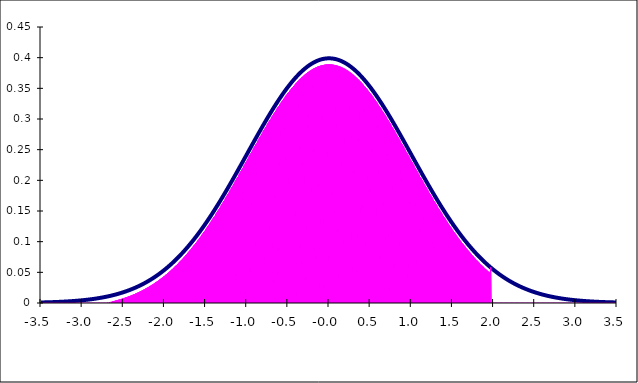
| Category | Series 0 | Series 1 |
|---|---|---|
| -3.5 | 0.001 | 0 |
| -3.495 | 0.001 | 0 |
| -3.49 | 0.001 | 0 |
| -3.4850000000000003 | 0.001 | 0 |
| -3.4800000000000004 | 0.001 | 0 |
| -3.4750000000000005 | 0.001 | 0 |
| -3.4700000000000006 | 0.001 | 0 |
| -3.4650000000000007 | 0.001 | 0 |
| -3.460000000000001 | 0.001 | 0 |
| -3.455000000000001 | 0.001 | 0 |
| -3.450000000000001 | 0.001 | 0 |
| -3.445000000000001 | 0.001 | 0 |
| -3.4400000000000013 | 0.001 | 0 |
| -3.4350000000000014 | 0.001 | 0 |
| -3.4300000000000015 | 0.001 | 0 |
| -3.4250000000000016 | 0.001 | 0 |
| -3.4200000000000017 | 0.001 | 0 |
| -3.415000000000002 | 0.001 | 0 |
| -3.410000000000002 | 0.001 | 0 |
| -3.405000000000002 | 0.001 | 0 |
| -3.400000000000002 | 0.001 | 0 |
| -3.3950000000000022 | 0.001 | 0 |
| -3.3900000000000023 | 0.001 | 0 |
| -3.3850000000000025 | 0.001 | 0 |
| -3.3800000000000026 | 0.001 | 0 |
| -3.3750000000000027 | 0.001 | 0 |
| -3.3700000000000028 | 0.001 | 0 |
| -3.365000000000003 | 0.001 | 0 |
| -3.360000000000003 | 0.001 | 0 |
| -3.355000000000003 | 0.001 | 0 |
| -3.350000000000003 | 0.001 | 0 |
| -3.3450000000000033 | 0.001 | 0 |
| -3.3400000000000034 | 0.002 | 0 |
| -3.3350000000000035 | 0.002 | 0 |
| -3.3300000000000036 | 0.002 | 0 |
| -3.3250000000000037 | 0.002 | 0 |
| -3.320000000000004 | 0.002 | 0 |
| -3.315000000000004 | 0.002 | 0 |
| -3.310000000000004 | 0.002 | 0 |
| -3.305000000000004 | 0.002 | 0 |
| -3.3000000000000043 | 0.002 | 0 |
| -3.2950000000000044 | 0.002 | 0 |
| -3.2900000000000045 | 0.002 | 0 |
| -3.2850000000000046 | 0.002 | 0 |
| -3.2800000000000047 | 0.002 | 0 |
| -3.275000000000005 | 0.002 | 0 |
| -3.270000000000005 | 0.002 | 0 |
| -3.265000000000005 | 0.002 | 0 |
| -3.260000000000005 | 0.002 | 0 |
| -3.2550000000000052 | 0.002 | 0 |
| -3.2500000000000053 | 0.002 | 0 |
| -3.2450000000000054 | 0.002 | 0 |
| -3.2400000000000055 | 0.002 | 0 |
| -3.2350000000000056 | 0.002 | 0 |
| -3.2300000000000058 | 0.002 | 0 |
| -3.225000000000006 | 0.002 | 0 |
| -3.220000000000006 | 0.002 | 0 |
| -3.215000000000006 | 0.002 | 0 |
| -3.210000000000006 | 0.002 | 0 |
| -3.2050000000000063 | 0.002 | 0 |
| -3.2000000000000064 | 0.002 | 0 |
| -3.1950000000000065 | 0.002 | 0 |
| -3.1900000000000066 | 0.002 | 0 |
| -3.1850000000000067 | 0.003 | 0 |
| -3.180000000000007 | 0.003 | 0 |
| -3.175000000000007 | 0.003 | 0 |
| -3.170000000000007 | 0.003 | 0 |
| -3.165000000000007 | 0.003 | 0 |
| -3.1600000000000072 | 0.003 | 0 |
| -3.1550000000000074 | 0.003 | 0 |
| -3.1500000000000075 | 0.003 | 0 |
| -3.1450000000000076 | 0.003 | 0 |
| -3.1400000000000077 | 0.003 | 0 |
| -3.135000000000008 | 0.003 | 0 |
| -3.130000000000008 | 0.003 | 0 |
| -3.125000000000008 | 0.003 | 0 |
| -3.120000000000008 | 0.003 | 0 |
| -3.115000000000008 | 0.003 | 0 |
| -3.1100000000000083 | 0.003 | 0 |
| -3.1050000000000084 | 0.003 | 0 |
| -3.1000000000000085 | 0.003 | 0 |
| -3.0950000000000086 | 0.003 | 0 |
| -3.0900000000000087 | 0.003 | 0 |
| -3.085000000000009 | 0.003 | 0 |
| -3.080000000000009 | 0.003 | 0 |
| -3.075000000000009 | 0.004 | 0 |
| -3.070000000000009 | 0.004 | 0 |
| -3.0650000000000093 | 0.004 | 0 |
| -3.0600000000000094 | 0.004 | 0 |
| -3.0550000000000095 | 0.004 | 0 |
| -3.0500000000000096 | 0.004 | 0 |
| -3.0450000000000097 | 0.004 | 0 |
| -3.04000000000001 | 0.004 | 0 |
| -3.03500000000001 | 0.004 | 0 |
| -3.03000000000001 | 0.004 | 0 |
| -3.02500000000001 | 0.004 | 0 |
| -3.0200000000000102 | 0.004 | 0 |
| -3.0150000000000103 | 0.004 | 0 |
| -3.0100000000000104 | 0.004 | 0 |
| -3.0050000000000106 | 0.004 | 0 |
| -3.0000000000000107 | 0.004 | 0 |
| -2.9950000000000108 | 0.004 | 0 |
| -2.990000000000011 | 0.005 | 0 |
| -2.985000000000011 | 0.005 | 0 |
| -2.980000000000011 | 0.005 | 0 |
| -2.975000000000011 | 0.005 | 0 |
| -2.9700000000000113 | 0.005 | 0 |
| -2.9650000000000114 | 0.005 | 0 |
| -2.9600000000000115 | 0.005 | 0 |
| -2.9550000000000116 | 0.005 | 0 |
| -2.9500000000000117 | 0.005 | 0 |
| -2.945000000000012 | 0.005 | 0 |
| -2.940000000000012 | 0.005 | 0 |
| -2.935000000000012 | 0.005 | 0 |
| -2.930000000000012 | 0.005 | 0 |
| -2.9250000000000123 | 0.006 | 0 |
| -2.9200000000000124 | 0.006 | 0 |
| -2.9150000000000125 | 0.006 | 0 |
| -2.9100000000000126 | 0.006 | 0 |
| -2.9050000000000127 | 0.006 | 0 |
| -2.900000000000013 | 0.006 | 0 |
| -2.895000000000013 | 0.006 | 0 |
| -2.890000000000013 | 0.006 | 0 |
| -2.885000000000013 | 0.006 | 0 |
| -2.880000000000013 | 0.006 | 0 |
| -2.8750000000000133 | 0.006 | 0 |
| -2.8700000000000134 | 0.006 | 0 |
| -2.8650000000000135 | 0.007 | 0 |
| -2.8600000000000136 | 0.007 | 0 |
| -2.8550000000000137 | 0.007 | 0 |
| -2.850000000000014 | 0.007 | 0 |
| -2.845000000000014 | 0.007 | 0 |
| -2.840000000000014 | 0.007 | 0 |
| -2.835000000000014 | 0.007 | 0 |
| -2.8300000000000143 | 0.007 | 0 |
| -2.8250000000000144 | 0.007 | 0 |
| -2.8200000000000145 | 0.007 | 0 |
| -2.8150000000000146 | 0.008 | 0 |
| -2.8100000000000147 | 0.008 | 0 |
| -2.805000000000015 | 0.008 | 0 |
| -2.800000000000015 | 0.008 | 0 |
| -2.795000000000015 | 0.008 | 0 |
| -2.790000000000015 | 0.008 | 0 |
| -2.7850000000000152 | 0.008 | 0 |
| -2.7800000000000153 | 0.008 | 0 |
| -2.7750000000000155 | 0.008 | 0 |
| -2.7700000000000156 | 0.009 | 0 |
| -2.7650000000000157 | 0.009 | 0 |
| -2.7600000000000158 | 0.009 | 0 |
| -2.755000000000016 | 0.009 | 0 |
| -2.750000000000016 | 0.009 | 0 |
| -2.745000000000016 | 0.009 | 0 |
| -2.740000000000016 | 0.009 | 0 |
| -2.7350000000000163 | 0.009 | 0 |
| -2.7300000000000164 | 0.01 | 0 |
| -2.7250000000000165 | 0.01 | 0 |
| -2.7200000000000166 | 0.01 | 0 |
| -2.7150000000000167 | 0.01 | 0 |
| -2.710000000000017 | 0.01 | 0 |
| -2.705000000000017 | 0.01 | 0 |
| -2.700000000000017 | 0.01 | 0 |
| -2.695000000000017 | 0.011 | 0 |
| -2.6900000000000173 | 0.011 | 0.001 |
| -2.6850000000000174 | 0.011 | 0 |
| -2.6800000000000175 | 0.011 | 0.001 |
| -2.6750000000000176 | 0.011 | 0 |
| -2.6700000000000177 | 0.011 | 0.001 |
| -2.665000000000018 | 0.011 | 0 |
| -2.660000000000018 | 0.012 | 0.002 |
| -2.655000000000018 | 0.012 | 0 |
| -2.650000000000018 | 0.012 | 0.002 |
| -2.6450000000000182 | 0.012 | 0 |
| -2.6400000000000183 | 0.012 | 0.002 |
| -2.6350000000000184 | 0.012 | 0 |
| -2.6300000000000185 | 0.013 | 0.003 |
| -2.6250000000000187 | 0.013 | 0 |
| -2.6200000000000188 | 0.013 | 0.003 |
| -2.615000000000019 | 0.013 | 0 |
| -2.610000000000019 | 0.013 | 0.003 |
| -2.605000000000019 | 0.013 | 0 |
| -2.600000000000019 | 0.014 | 0.004 |
| -2.5950000000000193 | 0.014 | 0 |
| -2.5900000000000194 | 0.014 | 0.004 |
| -2.5850000000000195 | 0.014 | 0 |
| -2.5800000000000196 | 0.014 | 0.004 |
| -2.5750000000000197 | 0.014 | 0 |
| -2.57000000000002 | 0.015 | 0.005 |
| -2.56500000000002 | 0.015 | 0 |
| -2.56000000000002 | 0.015 | 0.005 |
| -2.55500000000002 | 0.015 | 0 |
| -2.5500000000000203 | 0.015 | 0.005 |
| -2.5450000000000204 | 0.016 | 0 |
| -2.5400000000000205 | 0.016 | 0.006 |
| -2.5350000000000206 | 0.016 | 0 |
| -2.5300000000000207 | 0.016 | 0.006 |
| -2.525000000000021 | 0.016 | 0 |
| -2.520000000000021 | 0.017 | 0.007 |
| -2.515000000000021 | 0.017 | 0 |
| -2.510000000000021 | 0.017 | 0.007 |
| -2.505000000000021 | 0.017 | 0 |
| -2.5000000000000213 | 0.018 | 0.008 |
| -2.4950000000000214 | 0.018 | 0 |
| -2.4900000000000215 | 0.018 | 0.008 |
| -2.4850000000000216 | 0.018 | 0 |
| -2.4800000000000217 | 0.018 | 0.008 |
| -2.475000000000022 | 0.019 | 0 |
| -2.470000000000022 | 0.019 | 0.009 |
| -2.465000000000022 | 0.019 | 0 |
| -2.460000000000022 | 0.019 | 0.009 |
| -2.4550000000000223 | 0.02 | 0 |
| -2.4500000000000224 | 0.02 | 0.01 |
| -2.4450000000000225 | 0.02 | 0 |
| -2.4400000000000226 | 0.02 | 0.01 |
| -2.4350000000000227 | 0.021 | 0 |
| -2.430000000000023 | 0.021 | 0.011 |
| -2.425000000000023 | 0.021 | 0 |
| -2.420000000000023 | 0.021 | 0.011 |
| -2.415000000000023 | 0.022 | 0 |
| -2.4100000000000232 | 0.022 | 0.012 |
| -2.4050000000000233 | 0.022 | 0 |
| -2.4000000000000234 | 0.022 | 0.012 |
| -2.3950000000000236 | 0.023 | 0 |
| -2.3900000000000237 | 0.023 | 0.013 |
| -2.3850000000000238 | 0.023 | 0 |
| -2.380000000000024 | 0.023 | 0.013 |
| -2.375000000000024 | 0.024 | 0 |
| -2.370000000000024 | 0.024 | 0.014 |
| -2.365000000000024 | 0.024 | 0 |
| -2.3600000000000243 | 0.025 | 0.015 |
| -2.3550000000000244 | 0.025 | 0 |
| -2.3500000000000245 | 0.025 | 0.015 |
| -2.3450000000000246 | 0.026 | 0 |
| -2.3400000000000247 | 0.026 | 0.016 |
| -2.335000000000025 | 0.026 | 0 |
| -2.330000000000025 | 0.026 | 0.016 |
| -2.325000000000025 | 0.027 | 0 |
| -2.320000000000025 | 0.027 | 0.017 |
| -2.3150000000000253 | 0.027 | 0 |
| -2.3100000000000254 | 0.028 | 0.018 |
| -2.3050000000000255 | 0.028 | 0 |
| -2.3000000000000256 | 0.028 | 0.018 |
| -2.2950000000000257 | 0.029 | 0 |
| -2.290000000000026 | 0.029 | 0.019 |
| -2.285000000000026 | 0.029 | 0 |
| -2.280000000000026 | 0.03 | 0.02 |
| -2.275000000000026 | 0.03 | 0 |
| -2.270000000000026 | 0.03 | 0.02 |
| -2.2650000000000263 | 0.031 | 0 |
| -2.2600000000000264 | 0.031 | 0.021 |
| -2.2550000000000265 | 0.031 | 0 |
| -2.2500000000000266 | 0.032 | 0.022 |
| -2.2450000000000268 | 0.032 | 0 |
| -2.240000000000027 | 0.032 | 0.022 |
| -2.235000000000027 | 0.033 | 0 |
| -2.230000000000027 | 0.033 | 0.023 |
| -2.225000000000027 | 0.034 | 0 |
| -2.2200000000000273 | 0.034 | 0.024 |
| -2.2150000000000274 | 0.034 | 0 |
| -2.2100000000000275 | 0.035 | 0.025 |
| -2.2050000000000276 | 0.035 | 0 |
| -2.2000000000000277 | 0.035 | 0.025 |
| -2.195000000000028 | 0.036 | 0 |
| -2.190000000000028 | 0.036 | 0.026 |
| -2.185000000000028 | 0.037 | 0 |
| -2.180000000000028 | 0.037 | 0.027 |
| -2.1750000000000282 | 0.037 | 0 |
| -2.1700000000000284 | 0.038 | 0.028 |
| -2.1650000000000285 | 0.038 | 0 |
| -2.1600000000000286 | 0.039 | 0.029 |
| -2.1550000000000287 | 0.039 | 0 |
| -2.1500000000000288 | 0.04 | 0.03 |
| -2.145000000000029 | 0.04 | 0 |
| -2.140000000000029 | 0.04 | 0.03 |
| -2.135000000000029 | 0.041 | 0 |
| -2.130000000000029 | 0.041 | 0.031 |
| -2.1250000000000293 | 0.042 | 0 |
| -2.1200000000000294 | 0.042 | 0.032 |
| -2.1150000000000295 | 0.043 | 0 |
| -2.1100000000000296 | 0.043 | 0.033 |
| -2.1050000000000297 | 0.044 | 0 |
| -2.10000000000003 | 0.044 | 0.034 |
| -2.09500000000003 | 0.044 | 0 |
| -2.09000000000003 | 0.045 | 0.035 |
| -2.08500000000003 | 0.045 | 0 |
| -2.0800000000000303 | 0.046 | 0.036 |
| -2.0750000000000304 | 0.046 | 0 |
| -2.0700000000000305 | 0.047 | 0.037 |
| -2.0650000000000306 | 0.047 | 0 |
| -2.0600000000000307 | 0.048 | 0.038 |
| -2.055000000000031 | 0.048 | 0 |
| -2.050000000000031 | 0.049 | 0.039 |
| -2.045000000000031 | 0.049 | 0 |
| -2.040000000000031 | 0.05 | 0.04 |
| -2.0350000000000312 | 0.05 | 0 |
| -2.0300000000000313 | 0.051 | 0.041 |
| -2.0250000000000314 | 0.051 | 0 |
| -2.0200000000000315 | 0.052 | 0.042 |
| -2.0150000000000317 | 0.052 | 0 |
| -2.0100000000000318 | 0.053 | 0.043 |
| -2.005000000000032 | 0.053 | 0 |
| -2.000000000000032 | 0.054 | 0.044 |
| -1.995000000000032 | 0.055 | 0 |
| -1.990000000000032 | 0.055 | 0.045 |
| -1.985000000000032 | 0.056 | 0 |
| -1.980000000000032 | 0.056 | 0.046 |
| -1.975000000000032 | 0.057 | 0 |
| -1.970000000000032 | 0.057 | 0.047 |
| -1.965000000000032 | 0.058 | 0 |
| -1.960000000000032 | 0.058 | 0.048 |
| -1.955000000000032 | 0.059 | 0 |
| -1.950000000000032 | 0.06 | 0.05 |
| -1.945000000000032 | 0.06 | 0 |
| -1.940000000000032 | 0.061 | 0.051 |
| -1.935000000000032 | 0.061 | 0 |
| -1.930000000000032 | 0.062 | 0.052 |
| -1.925000000000032 | 0.063 | 0 |
| -1.920000000000032 | 0.063 | 0.053 |
| -1.915000000000032 | 0.064 | 0 |
| -1.910000000000032 | 0.064 | 0.054 |
| -1.905000000000032 | 0.065 | 0 |
| -1.9000000000000319 | 0.066 | 0.056 |
| -1.895000000000032 | 0.066 | 0 |
| -1.8900000000000319 | 0.067 | 0.057 |
| -1.885000000000032 | 0.068 | 0 |
| -1.8800000000000319 | 0.068 | 0.058 |
| -1.875000000000032 | 0.069 | 0 |
| -1.8700000000000319 | 0.069 | 0.059 |
| -1.865000000000032 | 0.07 | 0 |
| -1.8600000000000319 | 0.071 | 0.061 |
| -1.855000000000032 | 0.071 | 0 |
| -1.8500000000000318 | 0.072 | 0.062 |
| -1.845000000000032 | 0.073 | 0 |
| -1.8400000000000318 | 0.073 | 0.063 |
| -1.835000000000032 | 0.074 | 0 |
| -1.8300000000000318 | 0.075 | 0.065 |
| -1.825000000000032 | 0.075 | 0 |
| -1.8200000000000318 | 0.076 | 0.066 |
| -1.815000000000032 | 0.077 | 0 |
| -1.8100000000000318 | 0.078 | 0.068 |
| -1.805000000000032 | 0.078 | 0 |
| -1.8000000000000318 | 0.079 | 0.069 |
| -1.795000000000032 | 0.08 | 0 |
| -1.7900000000000318 | 0.08 | 0.07 |
| -1.785000000000032 | 0.081 | 0 |
| -1.7800000000000318 | 0.082 | 0.072 |
| -1.7750000000000319 | 0.083 | 0 |
| -1.7700000000000318 | 0.083 | 0.073 |
| -1.7650000000000319 | 0.084 | 0 |
| -1.7600000000000318 | 0.085 | 0.075 |
| -1.7550000000000319 | 0.086 | 0 |
| -1.7500000000000318 | 0.086 | 0.076 |
| -1.7450000000000319 | 0.087 | 0 |
| -1.7400000000000317 | 0.088 | 0.078 |
| -1.7350000000000319 | 0.089 | 0 |
| -1.7300000000000317 | 0.089 | 0.079 |
| -1.7250000000000318 | 0.09 | 0 |
| -1.7200000000000317 | 0.091 | 0.081 |
| -1.7150000000000318 | 0.092 | 0 |
| -1.7100000000000317 | 0.092 | 0.082 |
| -1.7050000000000318 | 0.093 | 0 |
| -1.7000000000000317 | 0.094 | 0.084 |
| -1.6950000000000318 | 0.095 | 0 |
| -1.6900000000000317 | 0.096 | 0.086 |
| -1.6850000000000318 | 0.096 | 0 |
| -1.6800000000000317 | 0.097 | 0.087 |
| -1.6750000000000318 | 0.098 | 0 |
| -1.6700000000000317 | 0.099 | 0.089 |
| -1.6650000000000318 | 0.1 | 0 |
| -1.6600000000000317 | 0.101 | 0.091 |
| -1.6550000000000318 | 0.101 | 0 |
| -1.6500000000000317 | 0.102 | 0.092 |
| -1.6450000000000318 | 0.103 | 0 |
| -1.6400000000000317 | 0.104 | 0.094 |
| -1.6350000000000318 | 0.105 | 0 |
| -1.6300000000000316 | 0.106 | 0.096 |
| -1.6250000000000318 | 0.107 | 0 |
| -1.6200000000000316 | 0.107 | 0.097 |
| -1.6150000000000317 | 0.108 | 0 |
| -1.6100000000000316 | 0.109 | 0.099 |
| -1.6050000000000317 | 0.11 | 0 |
| -1.6000000000000316 | 0.111 | 0.101 |
| -1.5950000000000317 | 0.112 | 0 |
| -1.5900000000000316 | 0.113 | 0.103 |
| -1.5850000000000317 | 0.114 | 0 |
| -1.5800000000000316 | 0.115 | 0.105 |
| -1.5750000000000317 | 0.115 | 0 |
| -1.5700000000000316 | 0.116 | 0.106 |
| -1.5650000000000317 | 0.117 | 0 |
| -1.5600000000000316 | 0.118 | 0.108 |
| -1.5550000000000317 | 0.119 | 0 |
| -1.5500000000000316 | 0.12 | 0.11 |
| -1.5450000000000317 | 0.121 | 0 |
| -1.5400000000000316 | 0.122 | 0.112 |
| -1.5350000000000317 | 0.123 | 0 |
| -1.5300000000000316 | 0.124 | 0.114 |
| -1.5250000000000317 | 0.125 | 0 |
| -1.5200000000000315 | 0.126 | 0.116 |
| -1.5150000000000317 | 0.127 | 0 |
| -1.5100000000000315 | 0.128 | 0.118 |
| -1.5050000000000316 | 0.129 | 0 |
| -1.5000000000000315 | 0.13 | 0.12 |
| -1.4950000000000316 | 0.13 | 0 |
| -1.4900000000000315 | 0.131 | 0.121 |
| -1.4850000000000316 | 0.132 | 0 |
| -1.4800000000000315 | 0.133 | 0.123 |
| -1.4750000000000316 | 0.134 | 0 |
| -1.4700000000000315 | 0.135 | 0.125 |
| -1.4650000000000316 | 0.136 | 0 |
| -1.4600000000000315 | 0.137 | 0.127 |
| -1.4550000000000316 | 0.138 | 0 |
| -1.4500000000000315 | 0.139 | 0.129 |
| -1.4450000000000316 | 0.14 | 0 |
| -1.4400000000000315 | 0.141 | 0.131 |
| -1.4350000000000316 | 0.142 | 0 |
| -1.4300000000000315 | 0.144 | 0.134 |
| -1.4250000000000316 | 0.145 | 0 |
| -1.4200000000000315 | 0.146 | 0.136 |
| -1.4150000000000316 | 0.147 | 0 |
| -1.4100000000000315 | 0.148 | 0.138 |
| -1.4050000000000316 | 0.149 | 0 |
| -1.4000000000000314 | 0.15 | 0.14 |
| -1.3950000000000315 | 0.151 | 0 |
| -1.3900000000000314 | 0.152 | 0.142 |
| -1.3850000000000315 | 0.153 | 0 |
| -1.3800000000000314 | 0.154 | 0.144 |
| -1.3750000000000315 | 0.155 | 0 |
| -1.3700000000000314 | 0.156 | 0.146 |
| -1.3650000000000315 | 0.157 | 0 |
| -1.3600000000000314 | 0.158 | 0.148 |
| -1.3550000000000315 | 0.159 | 0 |
| -1.3500000000000314 | 0.16 | 0.15 |
| -1.3450000000000315 | 0.161 | 0 |
| -1.3400000000000314 | 0.163 | 0.153 |
| -1.3350000000000315 | 0.164 | 0 |
| -1.3300000000000314 | 0.165 | 0.155 |
| -1.3250000000000315 | 0.166 | 0 |
| -1.3200000000000314 | 0.167 | 0.157 |
| -1.3150000000000315 | 0.168 | 0 |
| -1.3100000000000314 | 0.169 | 0.159 |
| -1.3050000000000315 | 0.17 | 0 |
| -1.3000000000000314 | 0.171 | 0.161 |
| -1.2950000000000315 | 0.172 | 0 |
| -1.2900000000000313 | 0.174 | 0.164 |
| -1.2850000000000315 | 0.175 | 0 |
| -1.2800000000000313 | 0.176 | 0.166 |
| -1.2750000000000314 | 0.177 | 0 |
| -1.2700000000000313 | 0.178 | 0.168 |
| -1.2650000000000314 | 0.179 | 0 |
| -1.2600000000000313 | 0.18 | 0.17 |
| -1.2550000000000314 | 0.182 | 0 |
| -1.2500000000000313 | 0.183 | 0.173 |
| -1.2450000000000314 | 0.184 | 0 |
| -1.2400000000000313 | 0.185 | 0.175 |
| -1.2350000000000314 | 0.186 | 0 |
| -1.2300000000000313 | 0.187 | 0.177 |
| -1.2250000000000314 | 0.188 | 0 |
| -1.2200000000000313 | 0.19 | 0.18 |
| -1.2150000000000314 | 0.191 | 0 |
| -1.2100000000000313 | 0.192 | 0.182 |
| -1.2050000000000314 | 0.193 | 0 |
| -1.2000000000000313 | 0.194 | 0.184 |
| -1.1950000000000314 | 0.195 | 0 |
| -1.1900000000000313 | 0.197 | 0.187 |
| -1.1850000000000314 | 0.198 | 0 |
| -1.1800000000000312 | 0.199 | 0.189 |
| -1.1750000000000314 | 0.2 | 0 |
| -1.1700000000000312 | 0.201 | 0.191 |
| -1.1650000000000313 | 0.202 | 0 |
| -1.1600000000000312 | 0.204 | 0.194 |
| -1.1550000000000313 | 0.205 | 0 |
| -1.1500000000000312 | 0.206 | 0.196 |
| -1.1450000000000313 | 0.207 | 0 |
| -1.1400000000000312 | 0.208 | 0.198 |
| -1.1350000000000313 | 0.209 | 0 |
| -1.1300000000000312 | 0.211 | 0.201 |
| -1.1250000000000313 | 0.212 | 0 |
| -1.1200000000000312 | 0.213 | 0.203 |
| -1.1150000000000313 | 0.214 | 0 |
| -1.1100000000000312 | 0.215 | 0.205 |
| -1.1050000000000313 | 0.217 | 0 |
| -1.1000000000000312 | 0.218 | 0.208 |
| -1.0950000000000313 | 0.219 | 0 |
| -1.0900000000000312 | 0.22 | 0.21 |
| -1.0850000000000313 | 0.221 | 0 |
| -1.0800000000000312 | 0.223 | 0.213 |
| -1.0750000000000313 | 0.224 | 0 |
| -1.0700000000000311 | 0.225 | 0.215 |
| -1.0650000000000313 | 0.226 | 0 |
| -1.0600000000000311 | 0.227 | 0.217 |
| -1.0550000000000312 | 0.229 | 0 |
| -1.0500000000000311 | 0.23 | 0.22 |
| -1.0450000000000312 | 0.231 | 0 |
| -1.0400000000000311 | 0.232 | 0.222 |
| -1.0350000000000312 | 0.234 | 0 |
| -1.0300000000000311 | 0.235 | 0.225 |
| -1.0250000000000312 | 0.236 | 0 |
| -1.020000000000031 | 0.237 | 0.227 |
| -1.0150000000000312 | 0.238 | 0 |
| -1.010000000000031 | 0.24 | 0.23 |
| -1.0050000000000312 | 0.241 | 0 |
| -1.000000000000031 | 0.242 | 0.232 |
| -0.9950000000000311 | 0.243 | 0 |
| -0.9900000000000311 | 0.244 | 0.234 |
| -0.9850000000000311 | 0.246 | 0 |
| -0.9800000000000311 | 0.247 | 0.237 |
| -0.9750000000000311 | 0.248 | 0 |
| -0.9700000000000311 | 0.249 | 0.239 |
| -0.965000000000031 | 0.25 | 0 |
| -0.960000000000031 | 0.252 | 0.242 |
| -0.955000000000031 | 0.253 | 0 |
| -0.950000000000031 | 0.254 | 0.244 |
| -0.945000000000031 | 0.255 | 0 |
| -0.940000000000031 | 0.256 | 0.246 |
| -0.935000000000031 | 0.258 | 0 |
| -0.930000000000031 | 0.259 | 0.249 |
| -0.925000000000031 | 0.26 | 0 |
| -0.920000000000031 | 0.261 | 0.251 |
| -0.915000000000031 | 0.262 | 0 |
| -0.910000000000031 | 0.264 | 0.254 |
| -0.905000000000031 | 0.265 | 0 |
| -0.900000000000031 | 0.266 | 0.256 |
| -0.895000000000031 | 0.267 | 0 |
| -0.890000000000031 | 0.268 | 0.258 |
| -0.885000000000031 | 0.27 | 0 |
| -0.880000000000031 | 0.271 | 0.261 |
| -0.875000000000031 | 0.272 | 0 |
| -0.870000000000031 | 0.273 | 0.263 |
| -0.865000000000031 | 0.274 | 0 |
| -0.860000000000031 | 0.276 | 0.266 |
| -0.855000000000031 | 0.277 | 0 |
| -0.850000000000031 | 0.278 | 0.268 |
| -0.845000000000031 | 0.279 | 0 |
| -0.8400000000000309 | 0.28 | 0.27 |
| -0.8350000000000309 | 0.282 | 0 |
| -0.8300000000000309 | 0.283 | 0.273 |
| -0.8250000000000309 | 0.284 | 0 |
| -0.8200000000000309 | 0.285 | 0.275 |
| -0.8150000000000309 | 0.286 | 0 |
| -0.8100000000000309 | 0.287 | 0.277 |
| -0.8050000000000309 | 0.289 | 0 |
| -0.8000000000000309 | 0.29 | 0.28 |
| -0.7950000000000309 | 0.291 | 0 |
| -0.7900000000000309 | 0.292 | 0.282 |
| -0.7850000000000309 | 0.293 | 0 |
| -0.7800000000000309 | 0.294 | 0.284 |
| -0.7750000000000309 | 0.295 | 0 |
| -0.7700000000000309 | 0.297 | 0.287 |
| -0.7650000000000309 | 0.298 | 0 |
| -0.7600000000000309 | 0.299 | 0.289 |
| -0.7550000000000309 | 0.3 | 0 |
| -0.7500000000000309 | 0.301 | 0.291 |
| -0.7450000000000309 | 0.302 | 0 |
| -0.7400000000000309 | 0.303 | 0.293 |
| -0.7350000000000309 | 0.305 | 0 |
| -0.7300000000000308 | 0.306 | 0.296 |
| -0.7250000000000308 | 0.307 | 0 |
| -0.7200000000000308 | 0.308 | 0.298 |
| -0.7150000000000308 | 0.309 | 0 |
| -0.7100000000000308 | 0.31 | 0.3 |
| -0.7050000000000308 | 0.311 | 0 |
| -0.7000000000000308 | 0.312 | 0.302 |
| -0.6950000000000308 | 0.313 | 0 |
| -0.6900000000000308 | 0.314 | 0.304 |
| -0.6850000000000308 | 0.316 | 0 |
| -0.6800000000000308 | 0.317 | 0.307 |
| -0.6750000000000308 | 0.318 | 0 |
| -0.6700000000000308 | 0.319 | 0.309 |
| -0.6650000000000308 | 0.32 | 0 |
| -0.6600000000000308 | 0.321 | 0.311 |
| -0.6550000000000308 | 0.322 | 0 |
| -0.6500000000000308 | 0.323 | 0.313 |
| -0.6450000000000308 | 0.324 | 0 |
| -0.6400000000000308 | 0.325 | 0.315 |
| -0.6350000000000308 | 0.326 | 0 |
| -0.6300000000000308 | 0.327 | 0.317 |
| -0.6250000000000308 | 0.328 | 0 |
| -0.6200000000000307 | 0.329 | 0.319 |
| -0.6150000000000307 | 0.33 | 0 |
| -0.6100000000000307 | 0.331 | 0.321 |
| -0.6050000000000307 | 0.332 | 0 |
| -0.6000000000000307 | 0.333 | 0.323 |
| -0.5950000000000307 | 0.334 | 0 |
| -0.5900000000000307 | 0.335 | 0.325 |
| -0.5850000000000307 | 0.336 | 0 |
| -0.5800000000000307 | 0.337 | 0.327 |
| -0.5750000000000307 | 0.338 | 0 |
| -0.5700000000000307 | 0.339 | 0.329 |
| -0.5650000000000307 | 0.34 | 0 |
| -0.5600000000000307 | 0.341 | 0.331 |
| -0.5550000000000307 | 0.342 | 0 |
| -0.5500000000000307 | 0.343 | 0.333 |
| -0.5450000000000307 | 0.344 | 0 |
| -0.5400000000000307 | 0.345 | 0.335 |
| -0.5350000000000307 | 0.346 | 0 |
| -0.5300000000000307 | 0.347 | 0.337 |
| -0.5250000000000307 | 0.348 | 0 |
| -0.5200000000000307 | 0.348 | 0.338 |
| -0.5150000000000307 | 0.349 | 0 |
| -0.5100000000000307 | 0.35 | 0.34 |
| -0.5050000000000306 | 0.351 | 0 |
| -0.5000000000000306 | 0.352 | 0.342 |
| -0.49500000000003064 | 0.353 | 0 |
| -0.49000000000003063 | 0.354 | 0.344 |
| -0.48500000000003063 | 0.355 | 0 |
| -0.4800000000000306 | 0.356 | 0.346 |
| -0.4750000000000306 | 0.356 | 0 |
| -0.4700000000000306 | 0.357 | 0.347 |
| -0.4650000000000306 | 0.358 | 0 |
| -0.4600000000000306 | 0.359 | 0.349 |
| -0.4550000000000306 | 0.36 | 0 |
| -0.4500000000000306 | 0.361 | 0.351 |
| -0.4450000000000306 | 0.361 | 0 |
| -0.4400000000000306 | 0.362 | 0.352 |
| -0.4350000000000306 | 0.363 | 0 |
| -0.4300000000000306 | 0.364 | 0.354 |
| -0.4250000000000306 | 0.364 | 0 |
| -0.42000000000003057 | 0.365 | 0.355 |
| -0.41500000000003057 | 0.366 | 0 |
| -0.41000000000003056 | 0.367 | 0.357 |
| -0.40500000000003056 | 0.368 | 0 |
| -0.40000000000003055 | 0.368 | 0.358 |
| -0.39500000000003055 | 0.369 | 0 |
| -0.39000000000003054 | 0.37 | 0.36 |
| -0.38500000000003054 | 0.37 | 0 |
| -0.38000000000003054 | 0.371 | 0.361 |
| -0.37500000000003053 | 0.372 | 0 |
| -0.3700000000000305 | 0.373 | 0.363 |
| -0.3650000000000305 | 0.373 | 0 |
| -0.3600000000000305 | 0.374 | 0.364 |
| -0.3550000000000305 | 0.375 | 0 |
| -0.3500000000000305 | 0.375 | 0.365 |
| -0.3450000000000305 | 0.376 | 0 |
| -0.3400000000000305 | 0.377 | 0.367 |
| -0.3350000000000305 | 0.377 | 0 |
| -0.3300000000000305 | 0.378 | 0.368 |
| -0.3250000000000305 | 0.378 | 0 |
| -0.3200000000000305 | 0.379 | 0.369 |
| -0.3150000000000305 | 0.38 | 0 |
| -0.3100000000000305 | 0.38 | 0.37 |
| -0.30500000000003047 | 0.381 | 0 |
| -0.30000000000003046 | 0.381 | 0.371 |
| -0.29500000000003046 | 0.382 | 0 |
| -0.29000000000003046 | 0.383 | 0.373 |
| -0.28500000000003045 | 0.383 | 0 |
| -0.28000000000003045 | 0.384 | 0.374 |
| -0.27500000000003044 | 0.384 | 0 |
| -0.27000000000003044 | 0.385 | 0.375 |
| -0.26500000000003043 | 0.385 | 0 |
| -0.26000000000003043 | 0.386 | 0.376 |
| -0.2550000000000304 | 0.386 | 0 |
| -0.2500000000000304 | 0.387 | 0.377 |
| -0.24500000000003042 | 0.387 | 0 |
| -0.2400000000000304 | 0.388 | 0.378 |
| -0.2350000000000304 | 0.388 | 0 |
| -0.2300000000000304 | 0.389 | 0.379 |
| -0.2250000000000304 | 0.389 | 0 |
| -0.2200000000000304 | 0.389 | 0.379 |
| -0.2150000000000304 | 0.39 | 0 |
| -0.21000000000003038 | 0.39 | 0.38 |
| -0.20500000000003038 | 0.391 | 0 |
| -0.20000000000003038 | 0.391 | 0.381 |
| -0.19500000000003037 | 0.391 | 0 |
| -0.19000000000003037 | 0.392 | 0.382 |
| -0.18500000000003036 | 0.392 | 0 |
| -0.18000000000003036 | 0.393 | 0.383 |
| -0.17500000000003035 | 0.393 | 0 |
| -0.17000000000003035 | 0.393 | 0.383 |
| -0.16500000000003034 | 0.394 | 0 |
| -0.16000000000003034 | 0.394 | 0.384 |
| -0.15500000000003034 | 0.394 | 0 |
| -0.15000000000003033 | 0.394 | 0.384 |
| -0.14500000000003033 | 0.395 | 0 |
| -0.14000000000003032 | 0.395 | 0.385 |
| -0.13500000000003032 | 0.395 | 0 |
| -0.1300000000000303 | 0.396 | 0.386 |
| -0.1250000000000303 | 0.396 | 0 |
| -0.12000000000003032 | 0.396 | 0.386 |
| -0.11500000000003031 | 0.396 | 0 |
| -0.11000000000003032 | 0.397 | 0.387 |
| -0.10500000000003032 | 0.397 | 0 |
| -0.10000000000003033 | 0.397 | 0.387 |
| -0.09500000000003032 | 0.397 | 0 |
| -0.09000000000003033 | 0.397 | 0.387 |
| -0.08500000000003033 | 0.398 | 0 |
| -0.08000000000003034 | 0.398 | 0.388 |
| -0.07500000000003033 | 0.398 | 0 |
| -0.07000000000003034 | 0.398 | 0.388 |
| -0.06500000000003034 | 0.398 | 0 |
| -0.06000000000003034 | 0.398 | 0.388 |
| -0.055000000000030344 | 0.398 | 0 |
| -0.05000000000003034 | 0.398 | 0.388 |
| -0.04500000000003034 | 0.399 | 0 |
| -0.04000000000003034 | 0.399 | 0.389 |
| -0.03500000000003034 | 0.399 | 0 |
| -0.030000000000030336 | 0.399 | 0.389 |
| -0.025000000000030335 | 0.399 | 0 |
| -0.020000000000030334 | 0.399 | 0.389 |
| -0.015000000000030333 | 0.399 | 0 |
| -0.010000000000030334 | 0.399 | 0.389 |
| -0.0050000000000303335 | 0.399 | 0 |
| -3.033337470093045e-14 | 0.399 | 0.389 |
| 0.004999999999969667 | 0.399 | 0 |
| 0.009999999999969667 | 0.399 | 0.389 |
| 0.014999999999969666 | 0.399 | 0 |
| 0.019999999999969667 | 0.399 | 0.389 |
| 0.024999999999969668 | 0.399 | 0 |
| 0.02999999999996967 | 0.399 | 0.389 |
| 0.034999999999969666 | 0.399 | 0 |
| 0.03999999999996967 | 0.399 | 0.389 |
| 0.04499999999996967 | 0.399 | 0 |
| 0.04999999999996967 | 0.398 | 0.388 |
| 0.05499999999996967 | 0.398 | 0 |
| 0.059999999999969675 | 0.398 | 0.388 |
| 0.06499999999996968 | 0.398 | 0 |
| 0.06999999999996967 | 0.398 | 0.388 |
| 0.07499999999996967 | 0.398 | 0 |
| 0.07999999999996966 | 0.398 | 0.388 |
| 0.08499999999996967 | 0.398 | 0 |
| 0.08999999999996966 | 0.397 | 0.387 |
| 0.09499999999996966 | 0.397 | 0 |
| 0.09999999999996965 | 0.397 | 0.387 |
| 0.10499999999996966 | 0.397 | 0 |
| 0.10999999999996965 | 0.397 | 0.387 |
| 0.11499999999996965 | 0.396 | 0 |
| 0.11999999999996964 | 0.396 | 0.386 |
| 0.12499999999996965 | 0.396 | 0 |
| 0.12999999999996964 | 0.396 | 0.386 |
| 0.13499999999996964 | 0.395 | 0 |
| 0.13999999999996965 | 0.395 | 0.385 |
| 0.14499999999996965 | 0.395 | 0 |
| 0.14999999999996966 | 0.394 | 0.384 |
| 0.15499999999996966 | 0.394 | 0 |
| 0.15999999999996967 | 0.394 | 0.384 |
| 0.16499999999996967 | 0.394 | 0 |
| 0.16999999999996968 | 0.393 | 0.383 |
| 0.17499999999996968 | 0.393 | 0 |
| 0.17999999999996968 | 0.393 | 0.383 |
| 0.1849999999999697 | 0.392 | 0 |
| 0.1899999999999697 | 0.392 | 0.382 |
| 0.1949999999999697 | 0.391 | 0 |
| 0.1999999999999697 | 0.391 | 0.381 |
| 0.2049999999999697 | 0.391 | 0 |
| 0.2099999999999697 | 0.39 | 0.38 |
| 0.21499999999996972 | 0.39 | 0 |
| 0.21999999999996972 | 0.389 | 0.379 |
| 0.22499999999996972 | 0.389 | 0 |
| 0.22999999999996973 | 0.389 | 0.379 |
| 0.23499999999996973 | 0.388 | 0 |
| 0.23999999999996974 | 0.388 | 0.378 |
| 0.24499999999996974 | 0.387 | 0 |
| 0.24999999999996975 | 0.387 | 0.377 |
| 0.25499999999996975 | 0.386 | 0 |
| 0.25999999999996976 | 0.386 | 0.376 |
| 0.26499999999996976 | 0.385 | 0 |
| 0.26999999999996976 | 0.385 | 0.375 |
| 0.27499999999996977 | 0.384 | 0 |
| 0.2799999999999698 | 0.384 | 0.374 |
| 0.2849999999999698 | 0.383 | 0 |
| 0.2899999999999698 | 0.383 | 0.373 |
| 0.2949999999999698 | 0.382 | 0 |
| 0.2999999999999698 | 0.381 | 0.371 |
| 0.3049999999999698 | 0.381 | 0 |
| 0.3099999999999698 | 0.38 | 0.37 |
| 0.3149999999999698 | 0.38 | 0 |
| 0.3199999999999698 | 0.379 | 0.369 |
| 0.3249999999999698 | 0.378 | 0 |
| 0.3299999999999698 | 0.378 | 0.368 |
| 0.3349999999999698 | 0.377 | 0 |
| 0.3399999999999698 | 0.377 | 0.367 |
| 0.34499999999996983 | 0.376 | 0 |
| 0.34999999999996984 | 0.375 | 0.365 |
| 0.35499999999996984 | 0.375 | 0 |
| 0.35999999999996984 | 0.374 | 0.364 |
| 0.36499999999996985 | 0.373 | 0 |
| 0.36999999999996985 | 0.373 | 0.363 |
| 0.37499999999996986 | 0.372 | 0 |
| 0.37999999999996986 | 0.371 | 0.361 |
| 0.38499999999996987 | 0.37 | 0 |
| 0.38999999999996987 | 0.37 | 0.36 |
| 0.3949999999999699 | 0.369 | 0 |
| 0.3999999999999699 | 0.368 | 0.358 |
| 0.4049999999999699 | 0.368 | 0 |
| 0.4099999999999699 | 0.367 | 0.357 |
| 0.4149999999999699 | 0.366 | 0 |
| 0.4199999999999699 | 0.365 | 0.355 |
| 0.4249999999999699 | 0.364 | 0 |
| 0.4299999999999699 | 0.364 | 0.354 |
| 0.4349999999999699 | 0.363 | 0 |
| 0.4399999999999699 | 0.362 | 0.352 |
| 0.4449999999999699 | 0.361 | 0 |
| 0.4499999999999699 | 0.361 | 0.351 |
| 0.45499999999996993 | 0.36 | 0 |
| 0.45999999999996993 | 0.359 | 0.349 |
| 0.46499999999996994 | 0.358 | 0 |
| 0.46999999999996994 | 0.357 | 0.347 |
| 0.47499999999996995 | 0.356 | 0 |
| 0.47999999999996995 | 0.356 | 0.346 |
| 0.48499999999996996 | 0.355 | 0 |
| 0.48999999999996996 | 0.354 | 0.344 |
| 0.49499999999996996 | 0.353 | 0 |
| 0.49999999999996997 | 0.352 | 0.342 |
| 0.5049999999999699 | 0.351 | 0 |
| 0.5099999999999699 | 0.35 | 0.34 |
| 0.5149999999999699 | 0.349 | 0 |
| 0.5199999999999699 | 0.348 | 0.338 |
| 0.5249999999999699 | 0.348 | 0 |
| 0.5299999999999699 | 0.347 | 0.337 |
| 0.5349999999999699 | 0.346 | 0 |
| 0.53999999999997 | 0.345 | 0.335 |
| 0.54499999999997 | 0.344 | 0 |
| 0.54999999999997 | 0.343 | 0.333 |
| 0.55499999999997 | 0.342 | 0 |
| 0.55999999999997 | 0.341 | 0.331 |
| 0.56499999999997 | 0.34 | 0 |
| 0.56999999999997 | 0.339 | 0.329 |
| 0.57499999999997 | 0.338 | 0 |
| 0.57999999999997 | 0.337 | 0.327 |
| 0.58499999999997 | 0.336 | 0 |
| 0.58999999999997 | 0.335 | 0.325 |
| 0.59499999999997 | 0.334 | 0 |
| 0.59999999999997 | 0.333 | 0.323 |
| 0.60499999999997 | 0.332 | 0 |
| 0.60999999999997 | 0.331 | 0.321 |
| 0.61499999999997 | 0.33 | 0 |
| 0.61999999999997 | 0.329 | 0.319 |
| 0.62499999999997 | 0.328 | 0 |
| 0.62999999999997 | 0.327 | 0.317 |
| 0.63499999999997 | 0.326 | 0 |
| 0.63999999999997 | 0.325 | 0.315 |
| 0.64499999999997 | 0.324 | 0 |
| 0.64999999999997 | 0.323 | 0.313 |
| 0.65499999999997 | 0.322 | 0 |
| 0.65999999999997 | 0.321 | 0.311 |
| 0.6649999999999701 | 0.32 | 0 |
| 0.6699999999999701 | 0.319 | 0.309 |
| 0.6749999999999701 | 0.318 | 0 |
| 0.6799999999999701 | 0.317 | 0.307 |
| 0.6849999999999701 | 0.316 | 0 |
| 0.6899999999999701 | 0.314 | 0.304 |
| 0.6949999999999701 | 0.313 | 0 |
| 0.6999999999999701 | 0.312 | 0.302 |
| 0.7049999999999701 | 0.311 | 0 |
| 0.7099999999999701 | 0.31 | 0.3 |
| 0.7149999999999701 | 0.309 | 0 |
| 0.7199999999999701 | 0.308 | 0.298 |
| 0.7249999999999701 | 0.307 | 0 |
| 0.7299999999999701 | 0.306 | 0.296 |
| 0.7349999999999701 | 0.305 | 0 |
| 0.7399999999999701 | 0.303 | 0.293 |
| 0.7449999999999701 | 0.302 | 0 |
| 0.7499999999999701 | 0.301 | 0.291 |
| 0.7549999999999701 | 0.3 | 0 |
| 0.7599999999999701 | 0.299 | 0.289 |
| 0.7649999999999701 | 0.298 | 0 |
| 0.7699999999999702 | 0.297 | 0.287 |
| 0.7749999999999702 | 0.295 | 0 |
| 0.7799999999999702 | 0.294 | 0.284 |
| 0.7849999999999702 | 0.293 | 0 |
| 0.7899999999999702 | 0.292 | 0.282 |
| 0.7949999999999702 | 0.291 | 0 |
| 0.7999999999999702 | 0.29 | 0.28 |
| 0.8049999999999702 | 0.289 | 0 |
| 0.8099999999999702 | 0.287 | 0.277 |
| 0.8149999999999702 | 0.286 | 0 |
| 0.8199999999999702 | 0.285 | 0.275 |
| 0.8249999999999702 | 0.284 | 0 |
| 0.8299999999999702 | 0.283 | 0.273 |
| 0.8349999999999702 | 0.282 | 0 |
| 0.8399999999999702 | 0.28 | 0.27 |
| 0.8449999999999702 | 0.279 | 0 |
| 0.8499999999999702 | 0.278 | 0.268 |
| 0.8549999999999702 | 0.277 | 0 |
| 0.8599999999999702 | 0.276 | 0.266 |
| 0.8649999999999702 | 0.274 | 0 |
| 0.8699999999999702 | 0.273 | 0.263 |
| 0.8749999999999702 | 0.272 | 0 |
| 0.8799999999999703 | 0.271 | 0.261 |
| 0.8849999999999703 | 0.27 | 0 |
| 0.8899999999999703 | 0.268 | 0.258 |
| 0.8949999999999703 | 0.267 | 0 |
| 0.8999999999999703 | 0.266 | 0.256 |
| 0.9049999999999703 | 0.265 | 0 |
| 0.9099999999999703 | 0.264 | 0.254 |
| 0.9149999999999703 | 0.262 | 0 |
| 0.9199999999999703 | 0.261 | 0.251 |
| 0.9249999999999703 | 0.26 | 0 |
| 0.9299999999999703 | 0.259 | 0.249 |
| 0.9349999999999703 | 0.258 | 0 |
| 0.9399999999999703 | 0.256 | 0.246 |
| 0.9449999999999703 | 0.255 | 0 |
| 0.9499999999999703 | 0.254 | 0.244 |
| 0.9549999999999703 | 0.253 | 0 |
| 0.9599999999999703 | 0.252 | 0.242 |
| 0.9649999999999703 | 0.25 | 0 |
| 0.9699999999999703 | 0.249 | 0.239 |
| 0.9749999999999703 | 0.248 | 0 |
| 0.9799999999999703 | 0.247 | 0.237 |
| 0.9849999999999703 | 0.246 | 0 |
| 0.9899999999999703 | 0.244 | 0.234 |
| 0.9949999999999704 | 0.243 | 0 |
| 0.9999999999999704 | 0.242 | 0.232 |
| 1.0049999999999704 | 0.241 | 0 |
| 1.0099999999999703 | 0.24 | 0.23 |
| 1.0149999999999701 | 0.238 | 0 |
| 1.0199999999999703 | 0.237 | 0.227 |
| 1.0249999999999702 | 0.236 | 0 |
| 1.0299999999999703 | 0.235 | 0.225 |
| 1.0349999999999702 | 0.234 | 0 |
| 1.0399999999999703 | 0.232 | 0.222 |
| 1.0449999999999702 | 0.231 | 0 |
| 1.0499999999999703 | 0.23 | 0.22 |
| 1.0549999999999702 | 0.229 | 0 |
| 1.0599999999999703 | 0.227 | 0.217 |
| 1.0649999999999702 | 0.226 | 0 |
| 1.0699999999999703 | 0.225 | 0.215 |
| 1.0749999999999702 | 0.224 | 0 |
| 1.0799999999999703 | 0.223 | 0.213 |
| 1.0849999999999702 | 0.221 | 0 |
| 1.0899999999999703 | 0.22 | 0.21 |
| 1.0949999999999702 | 0.219 | 0 |
| 1.0999999999999703 | 0.218 | 0.208 |
| 1.1049999999999702 | 0.217 | 0 |
| 1.1099999999999703 | 0.215 | 0.205 |
| 1.1149999999999702 | 0.214 | 0 |
| 1.1199999999999704 | 0.213 | 0.203 |
| 1.1249999999999702 | 0.212 | 0 |
| 1.1299999999999704 | 0.211 | 0.201 |
| 1.1349999999999703 | 0.209 | 0 |
| 1.1399999999999704 | 0.208 | 0.198 |
| 1.1449999999999703 | 0.207 | 0 |
| 1.1499999999999704 | 0.206 | 0.196 |
| 1.1549999999999703 | 0.205 | 0 |
| 1.1599999999999704 | 0.204 | 0.194 |
| 1.1649999999999703 | 0.202 | 0 |
| 1.1699999999999704 | 0.201 | 0.191 |
| 1.1749999999999703 | 0.2 | 0 |
| 1.1799999999999704 | 0.199 | 0.189 |
| 1.1849999999999703 | 0.198 | 0 |
| 1.1899999999999704 | 0.197 | 0.187 |
| 1.1949999999999703 | 0.195 | 0 |
| 1.1999999999999704 | 0.194 | 0.184 |
| 1.2049999999999703 | 0.193 | 0 |
| 1.2099999999999704 | 0.192 | 0.182 |
| 1.2149999999999703 | 0.191 | 0 |
| 1.2199999999999704 | 0.19 | 0.18 |
| 1.2249999999999703 | 0.188 | 0 |
| 1.2299999999999705 | 0.187 | 0.177 |
| 1.2349999999999703 | 0.186 | 0 |
| 1.2399999999999705 | 0.185 | 0.175 |
| 1.2449999999999704 | 0.184 | 0 |
| 1.2499999999999705 | 0.183 | 0.173 |
| 1.2549999999999704 | 0.182 | 0 |
| 1.2599999999999705 | 0.18 | 0.17 |
| 1.2649999999999704 | 0.179 | 0 |
| 1.2699999999999705 | 0.178 | 0.168 |
| 1.2749999999999704 | 0.177 | 0 |
| 1.2799999999999705 | 0.176 | 0.166 |
| 1.2849999999999704 | 0.175 | 0 |
| 1.2899999999999705 | 0.174 | 0.164 |
| 1.2949999999999704 | 0.172 | 0 |
| 1.2999999999999705 | 0.171 | 0.161 |
| 1.3049999999999704 | 0.17 | 0 |
| 1.3099999999999705 | 0.169 | 0.159 |
| 1.3149999999999704 | 0.168 | 0 |
| 1.3199999999999705 | 0.167 | 0.157 |
| 1.3249999999999704 | 0.166 | 0 |
| 1.3299999999999705 | 0.165 | 0.155 |
| 1.3349999999999704 | 0.164 | 0 |
| 1.3399999999999705 | 0.163 | 0.153 |
| 1.3449999999999704 | 0.161 | 0 |
| 1.3499999999999706 | 0.16 | 0.15 |
| 1.3549999999999705 | 0.159 | 0 |
| 1.3599999999999706 | 0.158 | 0.148 |
| 1.3649999999999705 | 0.157 | 0 |
| 1.3699999999999706 | 0.156 | 0.146 |
| 1.3749999999999705 | 0.155 | 0 |
| 1.3799999999999706 | 0.154 | 0.144 |
| 1.3849999999999705 | 0.153 | 0 |
| 1.3899999999999706 | 0.152 | 0.142 |
| 1.3949999999999705 | 0.151 | 0 |
| 1.3999999999999706 | 0.15 | 0.14 |
| 1.4049999999999705 | 0.149 | 0 |
| 1.4099999999999706 | 0.148 | 0.138 |
| 1.4149999999999705 | 0.147 | 0 |
| 1.4199999999999706 | 0.146 | 0.136 |
| 1.4249999999999705 | 0.145 | 0 |
| 1.4299999999999706 | 0.144 | 0.134 |
| 1.4349999999999705 | 0.142 | 0 |
| 1.4399999999999706 | 0.141 | 0.131 |
| 1.4449999999999705 | 0.14 | 0 |
| 1.4499999999999706 | 0.139 | 0.129 |
| 1.4549999999999705 | 0.138 | 0 |
| 1.4599999999999707 | 0.137 | 0.127 |
| 1.4649999999999705 | 0.136 | 0 |
| 1.4699999999999707 | 0.135 | 0.125 |
| 1.4749999999999706 | 0.134 | 0 |
| 1.4799999999999707 | 0.133 | 0.123 |
| 1.4849999999999706 | 0.132 | 0 |
| 1.4899999999999707 | 0.131 | 0.121 |
| 1.4949999999999706 | 0.13 | 0 |
| 1.4999999999999707 | 0.13 | 0.12 |
| 1.5049999999999706 | 0.129 | 0 |
| 1.5099999999999707 | 0.128 | 0.118 |
| 1.5149999999999706 | 0.127 | 0 |
| 1.5199999999999707 | 0.126 | 0.116 |
| 1.5249999999999706 | 0.125 | 0 |
| 1.5299999999999707 | 0.124 | 0.114 |
| 1.5349999999999706 | 0.123 | 0 |
| 1.5399999999999707 | 0.122 | 0.112 |
| 1.5449999999999706 | 0.121 | 0 |
| 1.5499999999999707 | 0.12 | 0.11 |
| 1.5549999999999706 | 0.119 | 0 |
| 1.5599999999999707 | 0.118 | 0.108 |
| 1.5649999999999706 | 0.117 | 0 |
| 1.5699999999999708 | 0.116 | 0.106 |
| 1.5749999999999706 | 0.115 | 0 |
| 1.5799999999999708 | 0.115 | 0.105 |
| 1.5849999999999707 | 0.114 | 0 |
| 1.5899999999999708 | 0.113 | 0.103 |
| 1.5949999999999707 | 0.112 | 0 |
| 1.5999999999999708 | 0.111 | 0.101 |
| 1.6049999999999707 | 0.11 | 0 |
| 1.6099999999999708 | 0.109 | 0.099 |
| 1.6149999999999707 | 0.108 | 0 |
| 1.6199999999999708 | 0.107 | 0.097 |
| 1.6249999999999707 | 0.107 | 0 |
| 1.6299999999999708 | 0.106 | 0.096 |
| 1.6349999999999707 | 0.105 | 0 |
| 1.6399999999999708 | 0.104 | 0.094 |
| 1.6449999999999707 | 0.103 | 0 |
| 1.6499999999999708 | 0.102 | 0.092 |
| 1.6549999999999707 | 0.101 | 0 |
| 1.6599999999999708 | 0.101 | 0.091 |
| 1.6649999999999707 | 0.1 | 0 |
| 1.6699999999999708 | 0.099 | 0.089 |
| 1.6749999999999707 | 0.098 | 0 |
| 1.6799999999999708 | 0.097 | 0.087 |
| 1.6849999999999707 | 0.096 | 0 |
| 1.6899999999999709 | 0.096 | 0.086 |
| 1.6949999999999708 | 0.095 | 0 |
| 1.6999999999999709 | 0.094 | 0.084 |
| 1.7049999999999708 | 0.093 | 0 |
| 1.7099999999999709 | 0.092 | 0.082 |
| 1.7149999999999708 | 0.092 | 0 |
| 1.7199999999999709 | 0.091 | 0.081 |
| 1.7249999999999708 | 0.09 | 0 |
| 1.729999999999971 | 0.089 | 0.079 |
| 1.7349999999999708 | 0.089 | 0 |
| 1.739999999999971 | 0.088 | 0.078 |
| 1.7449999999999708 | 0.087 | 0 |
| 1.749999999999971 | 0.086 | 0.076 |
| 1.7549999999999708 | 0.086 | 0 |
| 1.759999999999971 | 0.085 | 0.075 |
| 1.7649999999999708 | 0.084 | 0 |
| 1.769999999999971 | 0.083 | 0.073 |
| 1.7749999999999708 | 0.083 | 0 |
| 1.779999999999971 | 0.082 | 0.072 |
| 1.7849999999999708 | 0.081 | 0 |
| 1.789999999999971 | 0.08 | 0.07 |
| 1.7949999999999708 | 0.08 | 0 |
| 1.799999999999971 | 0.079 | 0.069 |
| 1.8049999999999708 | 0.078 | 0 |
| 1.809999999999971 | 0.078 | 0.068 |
| 1.8149999999999709 | 0.077 | 0 |
| 1.819999999999971 | 0.076 | 0.066 |
| 1.8249999999999709 | 0.075 | 0 |
| 1.829999999999971 | 0.075 | 0.065 |
| 1.8349999999999709 | 0.074 | 0 |
| 1.839999999999971 | 0.073 | 0.063 |
| 1.8449999999999709 | 0.073 | 0 |
| 1.849999999999971 | 0.072 | 0.062 |
| 1.854999999999971 | 0.071 | 0 |
| 1.859999999999971 | 0.071 | 0.061 |
| 1.864999999999971 | 0.07 | 0 |
| 1.869999999999971 | 0.069 | 0.059 |
| 1.874999999999971 | 0.069 | 0 |
| 1.879999999999971 | 0.068 | 0.058 |
| 1.884999999999971 | 0.068 | 0 |
| 1.889999999999971 | 0.067 | 0.057 |
| 1.894999999999971 | 0.066 | 0 |
| 1.899999999999971 | 0.066 | 0.056 |
| 1.904999999999971 | 0.065 | 0 |
| 1.909999999999971 | 0.064 | 0.054 |
| 1.914999999999971 | 0.064 | 0 |
| 1.919999999999971 | 0.063 | 0.053 |
| 1.924999999999971 | 0.063 | 0 |
| 1.929999999999971 | 0.062 | 0.052 |
| 1.934999999999971 | 0.061 | 0 |
| 1.939999999999971 | 0.061 | 0.051 |
| 1.944999999999971 | 0.06 | 0 |
| 1.949999999999971 | 0.06 | 0.05 |
| 1.954999999999971 | 0.059 | 0 |
| 1.959999999999971 | 0.058 | 0.048 |
| 1.964999999999971 | 0.058 | 0.058 |
| 1.969999999999971 | 0.057 | 0 |
| 1.974999999999971 | 0.057 | 0 |
| 1.9799999999999711 | 0.056 | 0 |
| 1.984999999999971 | 0.056 | 0 |
| 1.9899999999999711 | 0.055 | 0 |
| 1.994999999999971 | 0.055 | 0 |
| 1.9999999999999711 | 0.054 | 0 |
| 2.004999999999971 | 0.053 | 0 |
| 2.009999999999971 | 0.053 | 0 |
| 2.014999999999971 | 0.052 | 0 |
| 2.0199999999999707 | 0.052 | 0 |
| 2.0249999999999706 | 0.051 | 0 |
| 2.0299999999999705 | 0.051 | 0 |
| 2.0349999999999704 | 0.05 | 0 |
| 2.0399999999999703 | 0.05 | 0 |
| 2.04499999999997 | 0.049 | 0 |
| 2.04999999999997 | 0.049 | 0 |
| 2.05499999999997 | 0.048 | 0 |
| 2.05999999999997 | 0.048 | 0 |
| 2.0649999999999697 | 0.047 | 0 |
| 2.0699999999999696 | 0.047 | 0 |
| 2.0749999999999695 | 0.046 | 0 |
| 2.0799999999999694 | 0.046 | 0 |
| 2.0849999999999693 | 0.045 | 0 |
| 2.089999999999969 | 0.045 | 0 |
| 2.094999999999969 | 0.044 | 0 |
| 2.099999999999969 | 0.044 | 0 |
| 2.104999999999969 | 0.044 | 0 |
| 2.109999999999969 | 0.043 | 0 |
| 2.1149999999999687 | 0.043 | 0 |
| 2.1199999999999686 | 0.042 | 0 |
| 2.1249999999999685 | 0.042 | 0 |
| 2.1299999999999684 | 0.041 | 0 |
| 2.1349999999999683 | 0.041 | 0 |
| 2.139999999999968 | 0.04 | 0 |
| 2.144999999999968 | 0.04 | 0 |
| 2.149999999999968 | 0.04 | 0 |
| 2.154999999999968 | 0.039 | 0 |
| 2.1599999999999677 | 0.039 | 0 |
| 2.1649999999999676 | 0.038 | 0 |
| 2.1699999999999675 | 0.038 | 0 |
| 2.1749999999999674 | 0.037 | 0 |
| 2.1799999999999673 | 0.037 | 0 |
| 2.184999999999967 | 0.037 | 0 |
| 2.189999999999967 | 0.036 | 0 |
| 2.194999999999967 | 0.036 | 0 |
| 2.199999999999967 | 0.035 | 0 |
| 2.2049999999999668 | 0.035 | 0 |
| 2.2099999999999667 | 0.035 | 0 |
| 2.2149999999999666 | 0.034 | 0 |
| 2.2199999999999664 | 0.034 | 0 |
| 2.2249999999999663 | 0.034 | 0 |
| 2.2299999999999662 | 0.033 | 0 |
| 2.234999999999966 | 0.033 | 0 |
| 2.239999999999966 | 0.032 | 0 |
| 2.244999999999966 | 0.032 | 0 |
| 2.249999999999966 | 0.032 | 0 |
| 2.2549999999999657 | 0.031 | 0 |
| 2.2599999999999656 | 0.031 | 0 |
| 2.2649999999999655 | 0.031 | 0 |
| 2.2699999999999654 | 0.03 | 0 |
| 2.2749999999999653 | 0.03 | 0 |
| 2.279999999999965 | 0.03 | 0 |
| 2.284999999999965 | 0.029 | 0 |
| 2.289999999999965 | 0.029 | 0 |
| 2.294999999999965 | 0.029 | 0 |
| 2.2999999999999647 | 0.028 | 0 |
| 2.3049999999999646 | 0.028 | 0 |
| 2.3099999999999645 | 0.028 | 0 |
| 2.3149999999999644 | 0.027 | 0 |
| 2.3199999999999643 | 0.027 | 0 |
| 2.324999999999964 | 0.027 | 0 |
| 2.329999999999964 | 0.026 | 0 |
| 2.334999999999964 | 0.026 | 0 |
| 2.339999999999964 | 0.026 | 0 |
| 2.344999999999964 | 0.026 | 0 |
| 2.3499999999999637 | 0.025 | 0 |
| 2.3549999999999636 | 0.025 | 0 |
| 2.3599999999999635 | 0.025 | 0 |
| 2.3649999999999634 | 0.024 | 0 |
| 2.3699999999999632 | 0.024 | 0 |
| 2.374999999999963 | 0.024 | 0 |
| 2.379999999999963 | 0.023 | 0 |
| 2.384999999999963 | 0.023 | 0 |
| 2.389999999999963 | 0.023 | 0 |
| 2.3949999999999627 | 0.023 | 0 |
| 2.3999999999999626 | 0.022 | 0 |
| 2.4049999999999625 | 0.022 | 0 |
| 2.4099999999999624 | 0.022 | 0 |
| 2.4149999999999623 | 0.022 | 0 |
| 2.419999999999962 | 0.021 | 0 |
| 2.424999999999962 | 0.021 | 0 |
| 2.429999999999962 | 0.021 | 0 |
| 2.434999999999962 | 0.021 | 0 |
| 2.4399999999999618 | 0.02 | 0 |
| 2.4449999999999616 | 0.02 | 0 |
| 2.4499999999999615 | 0.02 | 0 |
| 2.4549999999999614 | 0.02 | 0 |
| 2.4599999999999613 | 0.019 | 0 |
| 2.4649999999999612 | 0.019 | 0 |
| 2.469999999999961 | 0.019 | 0 |
| 2.474999999999961 | 0.019 | 0 |
| 2.479999999999961 | 0.018 | 0 |
| 2.484999999999961 | 0.018 | 0 |
| 2.4899999999999607 | 0.018 | 0 |
| 2.4949999999999606 | 0.018 | 0 |
| 2.4999999999999605 | 0.018 | 0 |
| 2.5049999999999604 | 0.017 | 0 |
| 2.5099999999999603 | 0.017 | 0 |
| 2.51499999999996 | 0.017 | 0 |
| 2.51999999999996 | 0.017 | 0 |
| 2.52499999999996 | 0.016 | 0 |
| 2.52999999999996 | 0.016 | 0 |
| 2.5349999999999597 | 0.016 | 0 |
| 2.5399999999999596 | 0.016 | 0 |
| 2.5449999999999595 | 0.016 | 0 |
| 2.5499999999999594 | 0.015 | 0 |
| 2.5549999999999593 | 0.015 | 0 |
| 2.559999999999959 | 0.015 | 0 |
| 2.564999999999959 | 0.015 | 0 |
| 2.569999999999959 | 0.015 | 0 |
| 2.574999999999959 | 0.014 | 0 |
| 2.5799999999999588 | 0.014 | 0 |
| 2.5849999999999587 | 0.014 | 0 |
| 2.5899999999999586 | 0.014 | 0 |
| 2.5949999999999585 | 0.014 | 0 |
| 2.5999999999999583 | 0.014 | 0 |
| 2.6049999999999582 | 0.013 | 0 |
| 2.609999999999958 | 0.013 | 0 |
| 2.614999999999958 | 0.013 | 0 |
| 2.619999999999958 | 0.013 | 0 |
| 2.624999999999958 | 0.013 | 0 |
| 2.6299999999999577 | 0.013 | 0 |
| 2.6349999999999576 | 0.012 | 0 |
| 2.6399999999999575 | 0.012 | 0 |
| 2.6449999999999574 | 0.012 | 0 |
| 2.6499999999999573 | 0.012 | 0 |
| 2.654999999999957 | 0.012 | 0 |
| 2.659999999999957 | 0.012 | 0 |
| 2.664999999999957 | 0.011 | 0 |
| 2.669999999999957 | 0.011 | 0 |
| 2.6749999999999567 | 0.011 | 0 |
| 2.6799999999999566 | 0.011 | 0 |
| 2.6849999999999565 | 0.011 | 0 |
| 2.6899999999999564 | 0.011 | 0 |
| 2.6949999999999563 | 0.011 | 0 |
| 2.699999999999956 | 0.01 | 0 |
| 2.704999999999956 | 0.01 | 0 |
| 2.709999999999956 | 0.01 | 0 |
| 2.714999999999956 | 0.01 | 0 |
| 2.719999999999956 | 0.01 | 0 |
| 2.7249999999999557 | 0.01 | 0 |
| 2.7299999999999556 | 0.01 | 0 |
| 2.7349999999999555 | 0.009 | 0 |
| 2.7399999999999554 | 0.009 | 0 |
| 2.7449999999999553 | 0.009 | 0 |
| 2.749999999999955 | 0.009 | 0 |
| 2.754999999999955 | 0.009 | 0 |
| 2.759999999999955 | 0.009 | 0 |
| 2.764999999999955 | 0.009 | 0 |
| 2.7699999999999547 | 0.009 | 0 |
| 2.7749999999999546 | 0.008 | 0 |
| 2.7799999999999545 | 0.008 | 0 |
| 2.7849999999999544 | 0.008 | 0 |
| 2.7899999999999543 | 0.008 | 0 |
| 2.794999999999954 | 0.008 | 0 |
| 2.799999999999954 | 0.008 | 0 |
| 2.804999999999954 | 0.008 | 0 |
| 2.809999999999954 | 0.008 | 0 |
| 2.8149999999999538 | 0.008 | 0 |
| 2.8199999999999537 | 0.007 | 0 |
| 2.8249999999999535 | 0.007 | 0 |
| 2.8299999999999534 | 0.007 | 0 |
| 2.8349999999999533 | 0.007 | 0 |
| 2.8399999999999532 | 0.007 | 0 |
| 2.844999999999953 | 0.007 | 0 |
| 2.849999999999953 | 0.007 | 0 |
| 2.854999999999953 | 0.007 | 0 |
| 2.859999999999953 | 0.007 | 0 |
| 2.8649999999999527 | 0.007 | 0 |
| 2.8699999999999526 | 0.006 | 0 |
| 2.8749999999999525 | 0.006 | 0 |
| 2.8799999999999524 | 0.006 | 0 |
| 2.8849999999999523 | 0.006 | 0 |
| 2.889999999999952 | 0.006 | 0 |
| 2.894999999999952 | 0.006 | 0 |
| 2.899999999999952 | 0.006 | 0 |
| 2.904999999999952 | 0.006 | 0 |
| 2.9099999999999517 | 0.006 | 0 |
| 2.9149999999999516 | 0.006 | 0 |
| 2.9199999999999515 | 0.006 | 0 |
| 2.9249999999999514 | 0.006 | 0 |
| 2.9299999999999513 | 0.005 | 0 |
| 2.934999999999951 | 0.005 | 0 |
| 2.939999999999951 | 0.005 | 0 |
| 2.944999999999951 | 0.005 | 0 |
| 2.949999999999951 | 0.005 | 0 |
| 2.9549999999999508 | 0.005 | 0 |
| 2.9599999999999507 | 0.005 | 0 |
| 2.9649999999999506 | 0.005 | 0 |
| 2.9699999999999505 | 0.005 | 0 |
| 2.9749999999999504 | 0.005 | 0 |
| 2.9799999999999502 | 0.005 | 0 |
| 2.98499999999995 | 0.005 | 0 |
| 2.98999999999995 | 0.005 | 0 |
| 2.99499999999995 | 0.004 | 0 |
| 2.99999999999995 | 0.004 | 0 |
| 3.0049999999999497 | 0.004 | 0 |
| 3.0099999999999496 | 0.004 | 0 |
| 3.0149999999999495 | 0.004 | 0 |
| 3.0199999999999494 | 0.004 | 0 |
| 3.0249999999999493 | 0.004 | 0 |
| 3.029999999999949 | 0.004 | 0 |
| 3.034999999999949 | 0.004 | 0 |
| 3.039999999999949 | 0.004 | 0 |
| 3.044999999999949 | 0.004 | 0 |
| 3.0499999999999488 | 0.004 | 0 |
| 3.0549999999999486 | 0.004 | 0 |
| 3.0599999999999485 | 0.004 | 0 |
| 3.0649999999999484 | 0.004 | 0 |
| 3.0699999999999483 | 0.004 | 0 |
| 3.074999999999948 | 0.004 | 0 |
| 3.079999999999948 | 0.003 | 0 |
| 3.084999999999948 | 0.003 | 0 |
| 3.089999999999948 | 0.003 | 0 |
| 3.094999999999948 | 0.003 | 0 |
| 3.0999999999999477 | 0.003 | 0 |
| 3.1049999999999476 | 0.003 | 0 |
| 3.1099999999999475 | 0.003 | 0 |
| 3.1149999999999474 | 0.003 | 0 |
| 3.1199999999999473 | 0.003 | 0 |
| 3.124999999999947 | 0.003 | 0 |
| 3.129999999999947 | 0.003 | 0 |
| 3.134999999999947 | 0.003 | 0 |
| 3.139999999999947 | 0.003 | 0 |
| 3.1449999999999467 | 0.003 | 0 |
| 3.1499999999999466 | 0.003 | 0 |
| 3.1549999999999465 | 0.003 | 0 |
| 3.1599999999999464 | 0.003 | 0 |
| 3.1649999999999463 | 0.003 | 0 |
| 3.169999999999946 | 0.003 | 0 |
| 3.174999999999946 | 0.003 | 0 |
| 3.179999999999946 | 0.003 | 0 |
| 3.184999999999946 | 0.003 | 0 |
| 3.1899999999999458 | 0.002 | 0 |
| 3.1949999999999457 | 0.002 | 0 |
| 3.1999999999999456 | 0.002 | 0 |
| 3.2049999999999454 | 0.002 | 0 |
| 3.2099999999999453 | 0.002 | 0 |
| 3.2149999999999452 | 0.002 | 0 |
| 3.219999999999945 | 0.002 | 0 |
| 3.224999999999945 | 0.002 | 0 |
| 3.229999999999945 | 0.002 | 0 |
| 3.234999999999945 | 0.002 | 0 |
| 3.2399999999999447 | 0.002 | 0 |
| 3.2449999999999446 | 0.002 | 0 |
| 3.2499999999999445 | 0.002 | 0 |
| 3.2549999999999444 | 0.002 | 0 |
| 3.2599999999999443 | 0.002 | 0 |
| 3.264999999999944 | 0.002 | 0 |
| 3.269999999999944 | 0.002 | 0 |
| 3.274999999999944 | 0.002 | 0 |
| 3.279999999999944 | 0.002 | 0 |
| 3.2849999999999437 | 0.002 | 0 |
| 3.2899999999999436 | 0.002 | 0 |
| 3.2949999999999435 | 0.002 | 0 |
| 3.2999999999999434 | 0.002 | 0 |
| 3.3049999999999433 | 0.002 | 0 |
| 3.309999999999943 | 0.002 | 0 |
| 3.314999999999943 | 0.002 | 0 |
| 3.319999999999943 | 0.002 | 0 |
| 3.324999999999943 | 0.002 | 0 |
| 3.329999999999943 | 0.002 | 0 |
| 3.3349999999999427 | 0.002 | 0 |
| 3.3399999999999426 | 0.002 | 0 |
| 3.3449999999999425 | 0.001 | 0 |
| 3.3499999999999424 | 0.001 | 0 |
| 3.3549999999999423 | 0.001 | 0 |
| 3.359999999999942 | 0.001 | 0 |
| 3.364999999999942 | 0.001 | 0 |
| 3.369999999999942 | 0.001 | 0 |
| 3.374999999999942 | 0.001 | 0 |
| 3.3799999999999417 | 0.001 | 0 |
| 3.3849999999999416 | 0.001 | 0 |
| 3.3899999999999415 | 0.001 | 0 |
| 3.3949999999999414 | 0.001 | 0 |
| 3.3999999999999413 | 0.001 | 0 |
| 3.404999999999941 | 0.001 | 0 |
| 3.409999999999941 | 0.001 | 0 |
| 3.414999999999941 | 0.001 | 0 |
| 3.419999999999941 | 0.001 | 0 |
| 3.4249999999999408 | 0.001 | 0 |
| 3.4299999999999407 | 0.001 | 0 |
| 3.4349999999999405 | 0.001 | 0 |
| 3.4399999999999404 | 0.001 | 0 |
| 3.4449999999999403 | 0.001 | 0 |
| 3.4499999999999402 | 0.001 | 0 |
| 3.45499999999994 | 0.001 | 0 |
| 3.45999999999994 | 0.001 | 0 |
| 3.46499999999994 | 0.001 | 0 |
| 3.46999999999994 | 0.001 | 0 |
| 3.4749999999999397 | 0.001 | 0 |
| 3.4799999999999396 | 0.001 | 0 |
| 3.4849999999999395 | 0.001 | 0 |
| 3.4899999999999394 | 0.001 | 0 |
| 3.4949999999999393 | 0.001 | 0 |
| 3.499999999999939 | 0.001 | 0 |